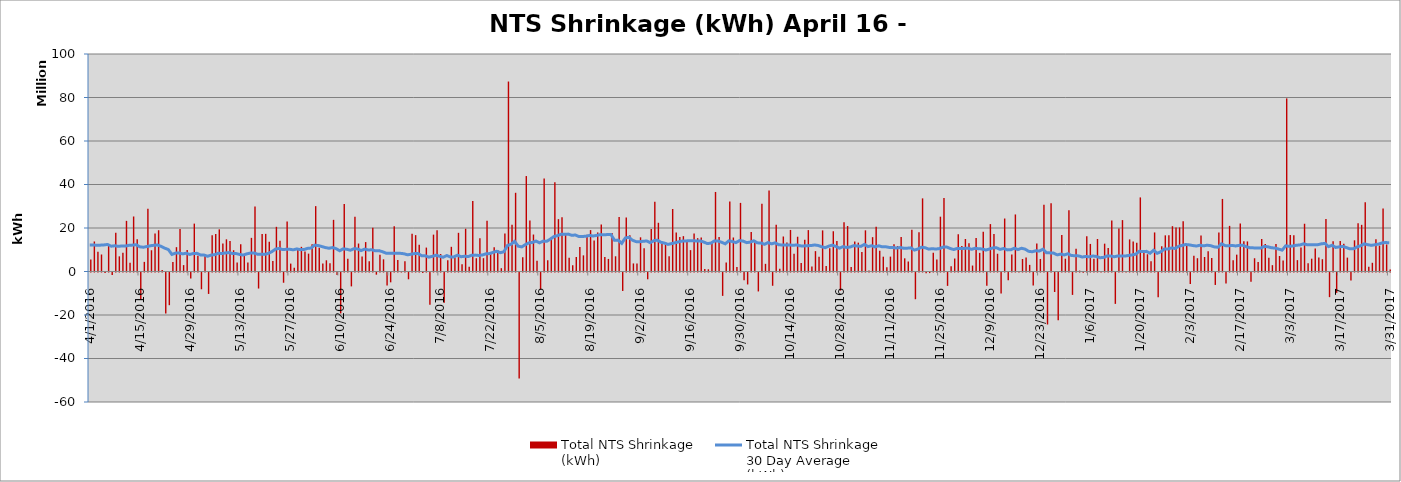
| Category | Total NTS Shrinkage
(kWh) |
|---|---|
| 4/1/16 | 5535887 |
| 4/2/16 | 13806413 |
| 4/3/16 | 9043796 |
| 4/4/16 | 7818288 |
| 4/5/16 | -262975 |
| 4/6/16 | 11727477 |
| 4/7/16 | -1105545 |
| 4/8/16 | 17761218 |
| 4/9/16 | 6972202 |
| 4/10/16 | 8642126 |
| 4/11/16 | 23282328 |
| 4/12/16 | 4011712 |
| 4/13/16 | 25294229 |
| 4/14/16 | 14867007 |
| 4/15/16 | -12330640 |
| 4/16/16 | 4421650 |
| 4/17/16 | 28817961 |
| 4/18/16 | 9772450 |
| 4/19/16 | 17524811 |
| 4/20/16 | 18972605 |
| 4/21/16 | 736150 |
| 4/22/16 | -18893691 |
| 4/23/16 | -15030541 |
| 4/24/16 | 4410582 |
| 4/25/16 | 11186961 |
| 4/26/16 | 19550488 |
| 4/27/16 | 2937112 |
| 4/28/16 | 9830118 |
| 4/29/16 | -2779713 |
| 4/30/16 | 22015972 |
| 5/1/16 | 7262252 |
| 5/2/16 | -7711497 |
| 5/3/16 | 7719483 |
| 5/4/16 | -9850590 |
| 5/5/16 | 16650554 |
| 5/6/16 | 17218141 |
| 5/7/16 | 19382453 |
| 5/8/16 | 12860168 |
| 5/9/16 | 14794720 |
| 5/10/16 | 13971912 |
| 5/11/16 | 9775796 |
| 5/12/16 | 4120797 |
| 5/13/16 | 12513168 |
| 5/14/16 | 7119777 |
| 5/15/16 | 4094843 |
| 5/16/16 | 15469294 |
| 5/17/16 | 29934743 |
| 5/18/16 | -7371971 |
| 5/19/16 | 17247708 |
| 5/20/16 | 17309931 |
| 5/21/16 | 13644269 |
| 5/22/16 | 4817087 |
| 5/23/16 | 20541324 |
| 5/24/16 | 14177822 |
| 5/25/16 | -4707552 |
| 5/26/16 | 23011309 |
| 5/27/16 | 3632244 |
| 5/28/16 | 1768132 |
| 5/29/16 | 10438132 |
| 5/30/16 | 11339676 |
| 5/31/16 | 9140720 |
| 6/1/16 | 8213635 |
| 6/2/16 | 12507140 |
| 6/3/16 | 30059560 |
| 6/4/16 | 10862901 |
| 6/5/16 | 3662227 |
| 6/6/16 | 5151322 |
| 6/7/16 | 3836781 |
| 6/8/16 | 23750954 |
| 6/9/16 | -1099687 |
| 6/10/16 | -18814241 |
| 6/11/16 | 30977345 |
| 6/12/16 | 5807415 |
| 6/13/16 | -6386243 |
| 6/14/16 | 25222743 |
| 6/15/16 | 12856348 |
| 6/16/16 | 6869801 |
| 6/17/16 | 13528859 |
| 6/18/16 | 4698453 |
| 6/19/16 | 20094654 |
| 6/20/16 | -1000782 |
| 6/21/16 | 7684253 |
| 6/22/16 | 5607083 |
| 6/23/16 | -5980700 |
| 6/24/16 | -4521270 |
| 6/25/16 | 20855920 |
| 6/26/16 | 5253551 |
| 6/27/16 | 5006 |
| 6/28/16 | 4663169 |
| 6/29/16 | -3116849 |
| 6/30/16 | 17332159 |
| 7/1/16 | 16724151 |
| 7/2/16 | 12317452 |
| 7/3/16 | -280087 |
| 7/4/16 | 11000825 |
| 7/5/16 | -14883298 |
| 7/6/16 | 16949783 |
| 7/7/16 | 18952385 |
| 7/8/16 | 8029232 |
| 7/9/16 | -13945656 |
| 7/10/16 | 5147579 |
| 7/11/16 | 11349203 |
| 7/12/16 | 6455553 |
| 7/13/16 | 17783295 |
| 7/14/16 | 3302864 |
| 7/15/16 | 19651452 |
| 7/16/16 | 2151943 |
| 7/17/16 | 32356615 |
| 7/18/16 | 6107781 |
| 7/19/16 | 15313466 |
| 7/20/16 | 6126734 |
| 7/21/16 | 23346874 |
| 7/22/16 | 8834324 |
| 7/23/16 | 11198631 |
| 7/24/16 | 9888902 |
| 7/25/16 | 1532877 |
| 7/26/16 | 17518053 |
| 7/27/16 | 87344065 |
| 7/28/16 | 21538678 |
| 7/29/16 | 36192775 |
| 7/30/16 | -48697675 |
| 7/31/16 | 6540659 |
| 8/1/16 | 43887632 |
| 8/2/16 | 23447480 |
| 8/3/16 | 16998393 |
| 8/4/16 | 4988257 |
| 8/5/16 | -7742341 |
| 8/6/16 | 42803467 |
| 8/7/16 | 5165573 |
| 8/8/16 | 15637054 |
| 8/9/16 | 40979782 |
| 8/10/16 | 24078638 |
| 8/11/16 | 24929738 |
| 8/12/16 | 17385018 |
| 8/13/16 | 6318473 |
| 8/14/16 | 2880706 |
| 8/15/16 | 6676283 |
| 8/16/16 | 11280275 |
| 8/17/16 | 7422291 |
| 8/18/16 | 16899808 |
| 8/19/16 | 19043488 |
| 8/20/16 | 14264003 |
| 8/21/16 | 17949251 |
| 8/22/16 | 21567521 |
| 8/23/16 | 6691811 |
| 8/24/16 | 5775398 |
| 8/25/16 | 17661778 |
| 8/26/16 | 6996124 |
| 8/27/16 | 25043626 |
| 8/28/16 | -8487072 |
| 8/29/16 | 24853442 |
| 8/30/16 | 16674340 |
| 8/31/16 | 3708355 |
| 9/1/16 | 3640916 |
| 9/2/16 | 15722176 |
| 9/3/16 | 10729211 |
| 9/4/16 | -3119441 |
| 9/5/16 | 19494529 |
| 9/6/16 | 32077366 |
| 9/7/16 | 22399780 |
| 9/8/16 | 12587903 |
| 9/9/16 | 12603573 |
| 9/10/16 | 7039286 |
| 9/11/16 | 28748535 |
| 9/12/16 | 17965831 |
| 9/13/16 | 15837631 |
| 9/14/16 | 16257489 |
| 9/15/16 | 13835925 |
| 9/16/16 | 9829408 |
| 9/17/16 | 17416574 |
| 9/18/16 | 15334650 |
| 9/19/16 | 15613008 |
| 9/20/16 | 1159008 |
| 9/21/16 | 1017889 |
| 9/22/16 | 13267285 |
| 9/23/16 | 36569663 |
| 9/24/16 | 15860370 |
| 9/25/16 | -10746731 |
| 9/26/16 | 4115987 |
| 9/27/16 | 32219611 |
| 9/28/16 | 15637865 |
| 9/29/16 | 2029142 |
| 9/30/16 | 31552962 |
| 10/1/16 | -3565264 |
| 10/2/16 | -5503428 |
| 10/3/16 | 18187280 |
| 10/4/16 | 14391579 |
| 10/5/16 | -8711747 |
| 10/6/16 | 31198764 |
| 10/7/16 | 3523231 |
| 10/8/16 | 37203868 |
| 10/9/16 | -6101860 |
| 10/10/16 | 21479836 |
| 10/11/16 | 1237741 |
| 10/12/16 | 16098930 |
| 10/13/16 | 13296741 |
| 10/14/16 | 19106233 |
| 10/15/16 | 8148645 |
| 10/16/16 | 15985275 |
| 10/17/16 | 3953496 |
| 10/18/16 | 14607826 |
| 10/19/16 | 19034721 |
| 10/20/16 | 2297365 |
| 10/21/16 | 9367167 |
| 10/22/16 | 6833389 |
| 10/23/16 | 18903828 |
| 10/24/16 | 2525184 |
| 10/25/16 | 10637314 |
| 10/26/16 | 18505873 |
| 10/27/16 | 14076496 |
| 10/28/16 | -8312953 |
| 10/29/16 | 22644130 |
| 10/30/16 | 20906260 |
| 10/31/16 | 2029439 |
| 11/1/16 | 13810020 |
| 11/2/16 | 13263169 |
| 11/3/16 | 8934208 |
| 11/4/16 | 18929796 |
| 11/5/16 | 493963 |
| 11/6/16 | 15792226 |
| 11/7/16 | 20569945 |
| 11/8/16 | 9543595 |
| 11/9/16 | 6815381 |
| 11/10/16 | 2008042 |
| 11/11/16 | 6842275 |
| 11/12/16 | 12534195 |
| 11/13/16 | 11737492 |
| 11/14/16 | 15811471 |
| 11/15/16 | 6056768 |
| 11/16/16 | 4594810 |
| 11/17/16 | 19219318 |
| 11/18/16 | -12283176 |
| 11/19/16 | 18056112 |
| 11/20/16 | 33622235 |
| 11/21/16 | -345701 |
| 11/22/16 | -262601 |
| 11/23/16 | 8655821 |
| 11/24/16 | 5483747 |
| 11/25/16 | 25203067 |
| 11/26/16 | 33792690 |
| 11/27/16 | -6148351 |
| 11/28/16 | 2465328 |
| 11/29/16 | 5970727 |
| 11/30/16 | 17112356 |
| 12/1/16 | 11772202 |
| 12/2/16 | 14945434 |
| 12/3/16 | 12992752 |
| 12/4/16 | 2738063 |
| 12/5/16 | 15394245 |
| 12/6/16 | 8560640 |
| 12/7/16 | 18238238 |
| 12/8/16 | -6137517 |
| 12/9/16 | 21796590 |
| 12/10/16 | 17298370 |
| 12/11/16 | 8162394 |
| 12/12/16 | -9662674 |
| 12/13/16 | 24361012 |
| 12/14/16 | -3553359 |
| 12/15/16 | 7860796 |
| 12/16/16 | 26228711 |
| 12/17/16 | 108375 |
| 12/18/16 | 5755006 |
| 12/19/16 | 6403176 |
| 12/20/16 | 3042419 |
| 12/21/16 | -5938774 |
| 12/22/16 | 12898332 |
| 12/23/16 | 5765469 |
| 12/24/16 | 30733298 |
| 12/25/16 | -23909427 |
| 12/26/16 | 31402668 |
| 12/27/16 | -8965641 |
| 12/28/16 | -21956468 |
| 12/29/16 | 16834190 |
| 12/30/16 | 5883732 |
| 12/31/16 | 28142475 |
| 1/1/17 | -10297616 |
| 1/2/17 | 10425836 |
| 1/3/17 | 410354 |
| 1/4/17 | -158991 |
| 1/5/17 | 16233876 |
| 1/6/17 | 12677040 |
| 1/7/17 | 5864712 |
| 1/8/17 | 14932594 |
| 1/9/17 | 245297 |
| 1/10/17 | 12805465 |
| 1/11/17 | 10812919 |
| 1/12/17 | 23394611 |
| 1/13/17 | -14423685 |
| 1/14/17 | 19720937 |
| 1/15/17 | 23631614 |
| 1/16/17 | 227959 |
| 1/17/17 | 14754776 |
| 1/18/17 | 13745766 |
| 1/19/17 | 13176722 |
| 1/20/17 | 34068821 |
| 1/21/17 | 9422662 |
| 1/22/17 | 7919789 |
| 1/23/17 | 4697536 |
| 1/24/17 | 17959666 |
| 1/25/17 | -11417492 |
| 1/26/17 | 11652845 |
| 1/27/17 | 16621557 |
| 1/28/17 | 16698470 |
| 1/29/17 | 20829657 |
| 1/30/17 | 20268729 |
| 1/31/17 | 20272371 |
| 2/1/17 | 23113426 |
| 2/2/17 | 12385322 |
| 2/3/17 | -5292013 |
| 2/4/17 | 7189466 |
| 2/5/17 | 6108355 |
| 2/6/17 | 16528155 |
| 2/7/17 | 6658608 |
| 2/8/17 | 9309409 |
| 2/9/17 | 6209782 |
| 2/10/17 | -5722212 |
| 2/11/17 | 17873968 |
| 2/12/17 | 33361117 |
| 2/13/17 | -5086155 |
| 2/14/17 | 20977709 |
| 2/15/17 | 5218042 |
| 2/16/17 | 7748299 |
| 2/17/17 | 22043887 |
| 2/18/17 | 13939369 |
| 2/19/17 | 13828051 |
| 2/20/17 | -4289446 |
| 2/21/17 | 6096416 |
| 2/22/17 | 4373822 |
| 2/23/17 | 14937865 |
| 2/24/17 | 12691115 |
| 2/25/17 | 6375044 |
| 2/26/17 | 2914220 |
| 2/27/17 | 12610881 |
| 2/28/17 | 7115888 |
| 3/1/17 | 5038746 |
| 3/2/17 | 79585927 |
| 3/3/17 | 16759914 |
| 3/4/17 | 16687821 |
| 3/5/17 | 5232717 |
| 3/6/17 | 11008623 |
| 3/7/17 | 21957720 |
| 3/8/17 | 3846521 |
| 3/9/17 | 5897117 |
| 3/10/17 | 10567496 |
| 3/11/17 | 6440265 |
| 3/12/17 | 5658373 |
| 3/13/17 | 24084287 |
| 3/14/17 | -11331106 |
| 3/15/17 | 13873210 |
| 3/16/17 | -9344440 |
| 3/17/17 | 14064483 |
| 3/18/17 | 12802526 |
| 3/19/17 | 6388161 |
| 3/20/17 | -3653134 |
| 3/21/17 | 14347787 |
| 3/22/17 | 22171919 |
| 3/23/17 | 21452432 |
| 3/24/17 | 31822379 |
| 3/25/17 | 2220115 |
| 3/26/17 | 4004142 |
| 3/27/17 | 14874237 |
| 3/28/17 | 11909033 |
| 3/29/17 | 28976051 |
| 3/30/17 | 12423183 |
| 3/31/17 | 869507 |